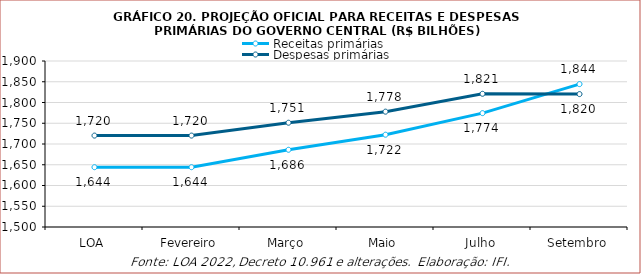
| Category | Receitas primárias | Despesas primárias |
|---|---|---|
| LOA | 1644118.9 | 1720286.1 |
| Fevereiro | 1644119 | 1720286 |
| Março | 1686086 | 1751269 |
| Maio | 1722418 | 1777946 |
| Julho | 1774372 | 1820990 |
| Setembro | 1844320 | 1820273 |